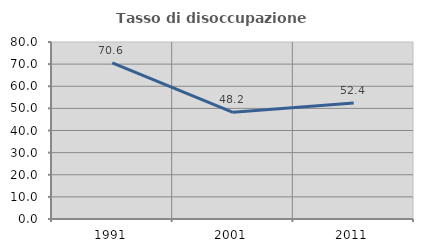
| Category | Tasso di disoccupazione giovanile  |
|---|---|
| 1991.0 | 70.588 |
| 2001.0 | 48.235 |
| 2011.0 | 52.439 |